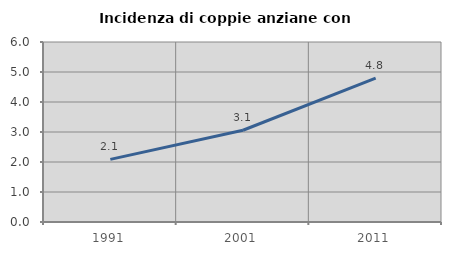
| Category | Incidenza di coppie anziane con figli |
|---|---|
| 1991.0 | 2.088 |
| 2001.0 | 3.059 |
| 2011.0 | 4.796 |